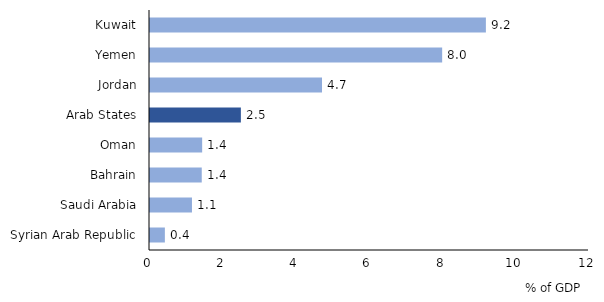
| Category | Series 0 |
|---|---|
| Syrian Arab Republic | 0.406 |
| Saudi Arabia | 1.147 |
| Bahrain | 1.415 |
| Oman | 1.426 |
| Arab States | 2.484 |
| Jordan | 4.702 |
| Yemen | 7.986 |
| Kuwait | 9.181 |